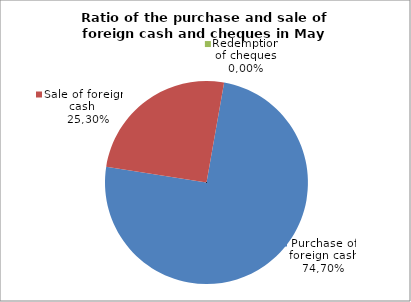
| Category | Purchase of foreign cash |
|---|---|
| 0 | 74.698 |
| 1 | 25.302 |
| 2 | 0 |